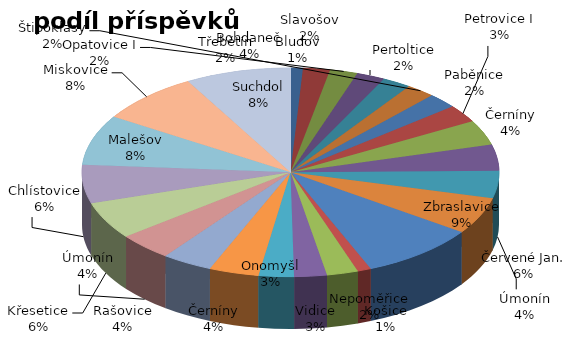
| Category | Series 0 |
|---|---|
| Bludov | 5560 |
| Třebětín | 12140 |
| Opatovice I | 12540 |
| Pertoltice | 12800 |
| Slavošov | 12920 |
| Štipoklasy | 13040 |
| Paběnice | 13480 |
| Petrovice I | 15820 |
| Černíny | 22500 |
| Bohdaneč | 23620 |
| Úmonín | 24720 |
| Červené Jan. | 33320 |
| Zbraslavice | 52660 |
| Košice | 6100 |
| Nepoměřice | 14160 |
| Vidice | 14740 |
| Onomyšl | 15900 |
| Černíny | 22500 |
| Rašovice | 22760 |
| Úmonín | 24720 |
| Křesetice | 33500 |
| Chlístovice | 34700 |
| Malešov | 45400 |
| Miskovice | 46200 |
| Suchdol | 47600 |